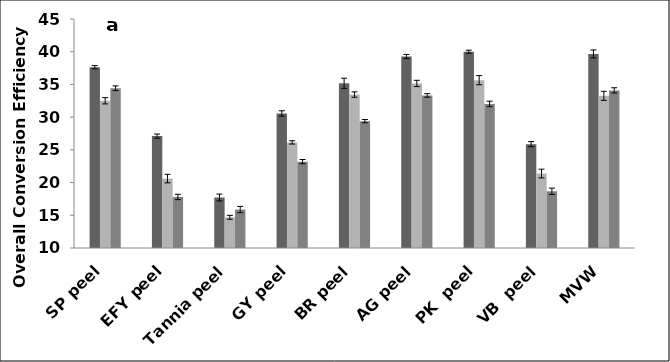
| Category | LRT  | LHT  60 min. |
|---|---|---|
| SP peel | 32.5 | 34.42 |
| EFY peel | 20.61 | 17.8 |
| Tannia peel | 14.69 | 15.88 |
| GY peel | 26.14 | 23.2 |
| BR peel | 33.45 | 29.39 |
| AG peel | 35.15 | 33.32 |
| PK  peel | 35.65 | 32.02 |
| VB  peel | 21.38 | 18.67 |
| MVW | 33.26 | 34.09 |